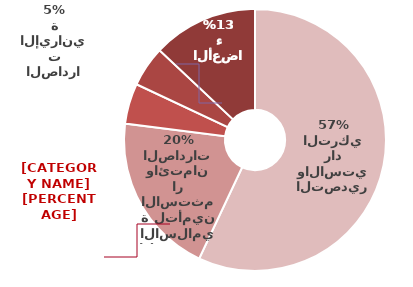
| Category | Series 0 |
|---|---|
| بنك التصدير والاستيراد التركي | 12.848 |
| المؤسسة الاسلامية لتأمين الاستثمار وائتمان الصادرات | 4.508 |
| المؤسسة العربية لضمان الاستثمار وائتمان الصادرات | 1.127 |
| صندوق ضمان الصادرات الإيرانية | 1.127 |
| باقي الأعضاء | 2.93 |